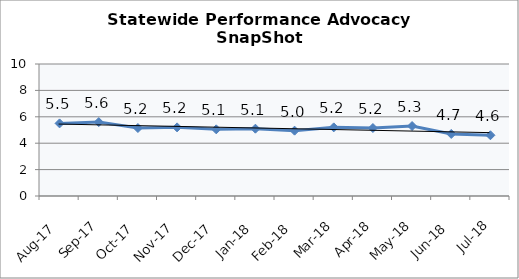
| Category | Statewide |
|---|---|
| Aug-17 | 5.5 |
| Sep-17 | 5.6 |
| Oct-17 | 5.15 |
| Nov-17 | 5.2 |
| Dec-17 | 5.05 |
| Jan-18 | 5.1 |
| Feb-18 | 4.95 |
| Mar-18 | 5.2 |
| Apr-18 | 5.15 |
| May-18 | 5.3 |
| Jun-18 | 4.7 |
| Jul-18 | 4.6 |